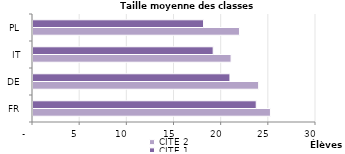
| Category | CITE 2 | CITE 1 |
|---|---|---|
| FR | 25.171 | 23.664 |
| DE | 23.921 | 20.878 |
| IT | 20.997 | 19.101 |
| PL | 21.889 | 18.08 |